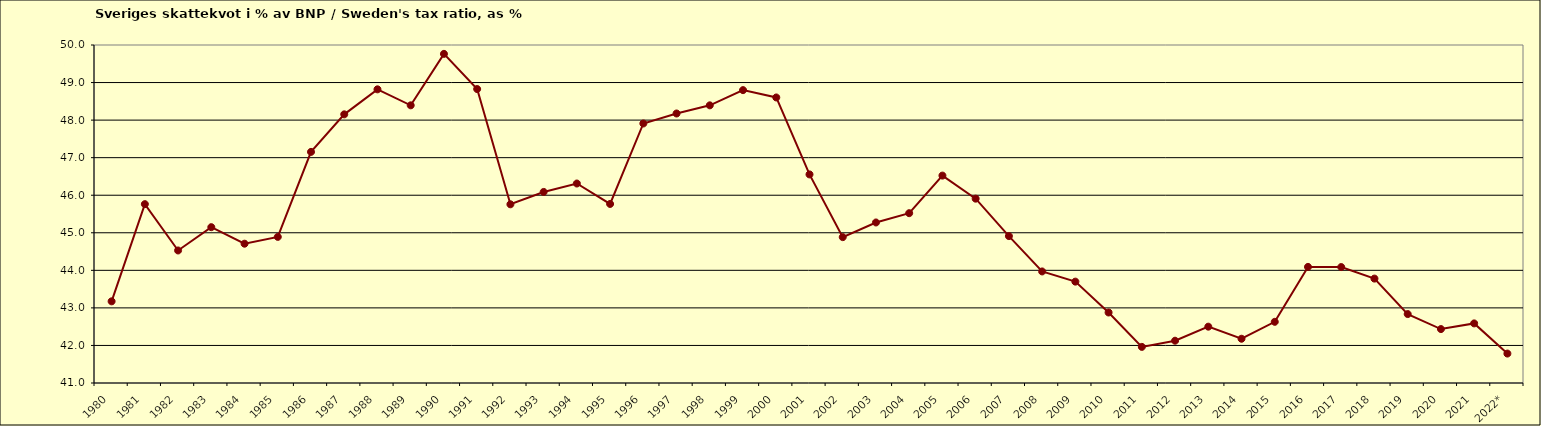
| Category | Series 0 |
|---|---|
| 1980 | 43.175 |
| 1981 | 45.762 |
| 1982 | 44.529 |
| 1983 | 45.149 |
| 1984 | 44.709 |
| 1985 | 44.891 |
| 1986 | 47.154 |
| 1987 | 48.154 |
| 1988 | 48.82 |
| 1989 | 48.394 |
| 1990 | 49.764 |
| 1991 | 48.827 |
| 1992 | 45.758 |
| 1993 | 46.087 |
| 1994 | 46.312 |
| 1995 | 45.767 |
| 1996 | 47.91 |
| 1997 | 48.176 |
| 1998 | 48.393 |
| 1999 | 48.798 |
| 2000 | 48.603 |
| 2001 | 46.554 |
| 2002 | 44.884 |
| 2003 | 45.274 |
| 2004 | 45.522 |
| 2005 | 46.522 |
| 2006 | 45.908 |
| 2007 | 44.912 |
| 2008 | 43.97 |
| 2009 | 43.699 |
| 2010 | 42.877 |
| 2011 | 41.962 |
| 2012 | 42.126 |
| 2013 | 42.5 |
| 2014 | 42.178 |
| 2015 | 42.629 |
| 2016 | 44.092 |
| 2017 | 44.087 |
| 2018 | 43.78 |
| 2019 | 42.836 |
| 2020 | 42.436 |
| 2021 | 42.587 |
| 2022* | 41.784 |